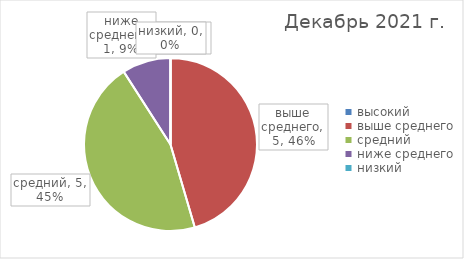
| Category | Series 0 |
|---|---|
| высокий | 0 |
| выше среднего | 5 |
| средний | 5 |
| ниже среднего | 1 |
| низкий | 0 |